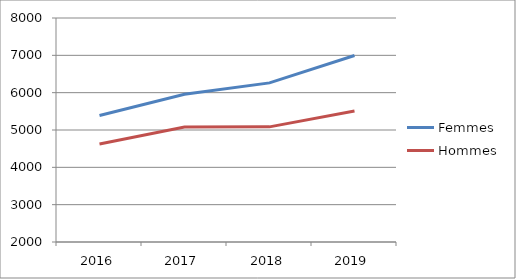
| Category | Femmes | Hommes |
|---|---|---|
| 2016.0 | 5390 | 4627 |
| 2017.0 | 5955 | 5079 |
| 2018.0 | 6262 | 5084 |
| 2019.0 | 6995 | 5508 |